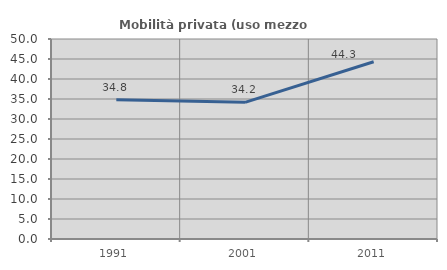
| Category | Mobilità privata (uso mezzo privato) |
|---|---|
| 1991.0 | 34.783 |
| 2001.0 | 34.171 |
| 2011.0 | 44.311 |